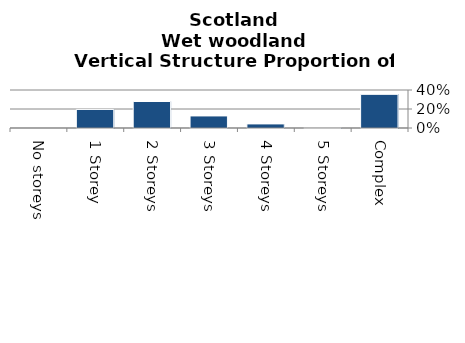
| Category | Wet woodland |
|---|---|
| No storeys | 0 |
| 1 Storey | 0.195 |
| 2 Storeys | 0.279 |
| 3 Storeys | 0.127 |
| 4 Storeys | 0.043 |
| 5 Storeys | 0.001 |
| Complex | 0.354 |